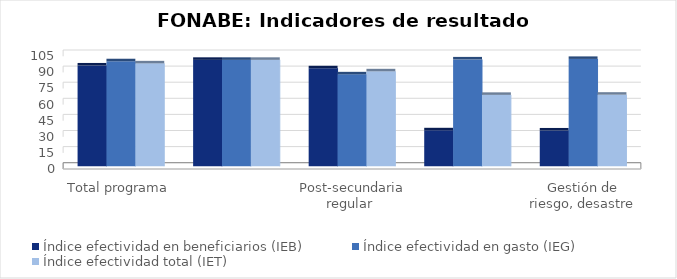
| Category | Índice efectividad en beneficiarios (IEB) | Índice efectividad en gasto (IEG)  | Índice efectividad total (IET) |
|---|---|---|---|
| Total programa | 93.893 | 97.825 | 95.859 |
|   Primaria | 99.145 | 99.138 | 99.142 |
| Post-secundaria regular  | 91.264 | 85.62 | 88.442 |
| Gestión de riesgo, desastre y/o emer. Primaria  | 33.489 | 99.532 | 66.511 |
| Gestión de riesgo, desastre y/o emer. Secundaria | 33.333 | 100 | 66.667 |